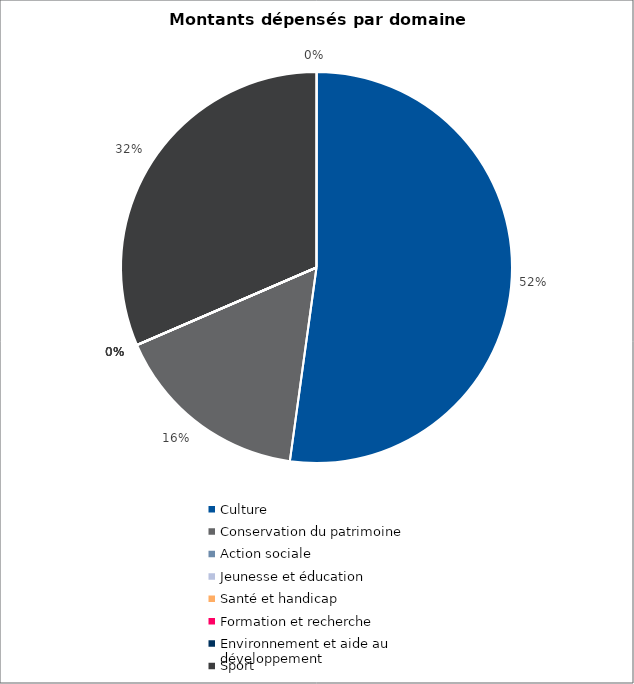
| Category | Series 0 |
|---|---|
| Culture | 447325 |
| Conservation du patrimoine | 140000 |
| Action sociale | 0 |
| Jeunesse et éducation | 0 |
| Santé et handicap | 0 |
| Formation et recherche | 0 |
| Environnement et aide au
développement | 0 |
| Sport | 270000 |
| Autres projets d’utilité publique | 0 |